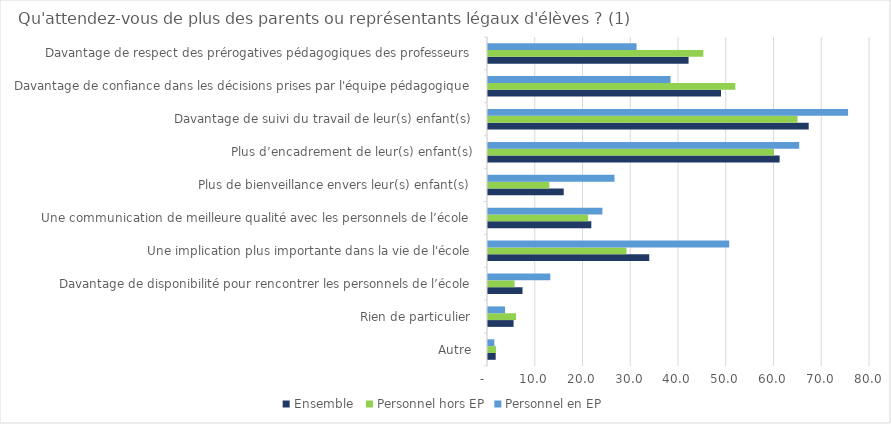
| Category | Ensemble  | Personnel hors EP | Personnel en EP |
|---|---|---|---|
| Autre | 1.611 | 1.693 | 1.324 |
| Rien de particulier | 5.358 | 5.867 | 3.568 |
| Davantage de disponibilité pour rencontrer les personnels de l’école | 7.228 | 5.572 | 13.054 |
| Une implication plus importante dans la vie de l'école | 33.765 | 29.007 | 50.513 |
| Une communication de meilleure qualité avec les personnels de l’école | 21.636 | 20.975 | 23.965 |
| Plus de bienveillance envers leur(s) enfant(s) | 15.862 | 12.84 | 26.497 |
| Plus d’encadrement de leur(s) enfant(s) | 61.073 | 59.906 | 65.178 |
| Davantage de suivi du travail de leur(s) enfant(s) | 67.164 | 64.822 | 75.409 |
| Davantage de confiance dans les décisions prises par l'équipe pédagogique | 48.796 | 51.8 | 38.222 |
| Davantage de respect des prérogatives pédagogiques des professeurs | 42.005 | 45.099 | 31.115 |